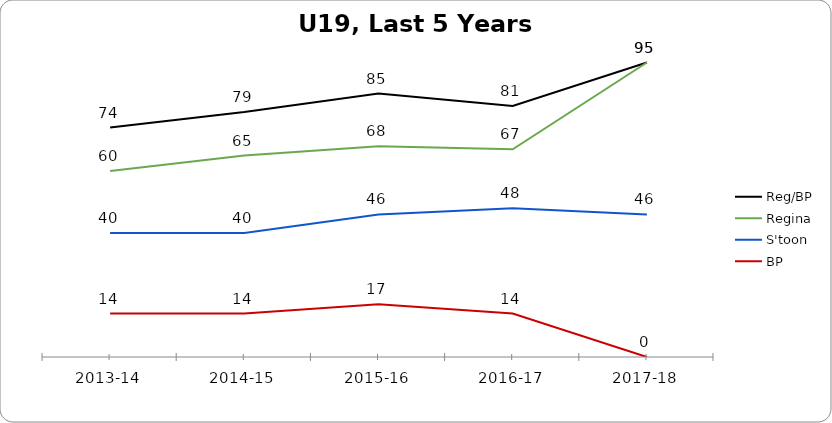
| Category | Reg/BP | Regina | S'toon | BP |
|---|---|---|---|---|
| 2013-14 | 74 | 60 | 40 | 14 |
| 2014-15 | 79 | 65 | 40 | 14 |
| 2015-16 | 85 | 68 | 46 | 17 |
| 2016-17 | 81 | 67 | 48 | 14 |
| 2017-18 | 95 | 95 | 46 | 0 |